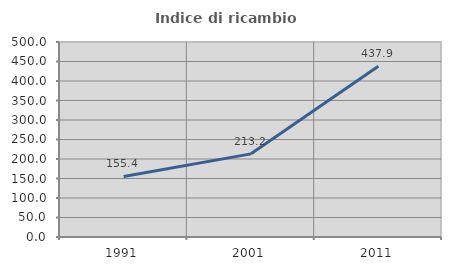
| Category | Indice di ricambio occupazionale  |
|---|---|
| 1991.0 | 155.36 |
| 2001.0 | 213.187 |
| 2011.0 | 437.926 |